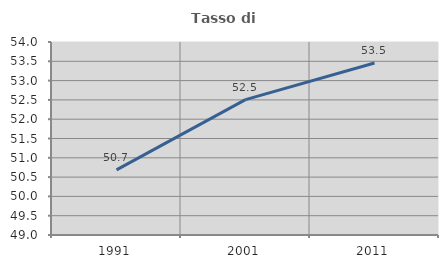
| Category | Tasso di occupazione   |
|---|---|
| 1991.0 | 50.687 |
| 2001.0 | 52.506 |
| 2011.0 | 53.456 |